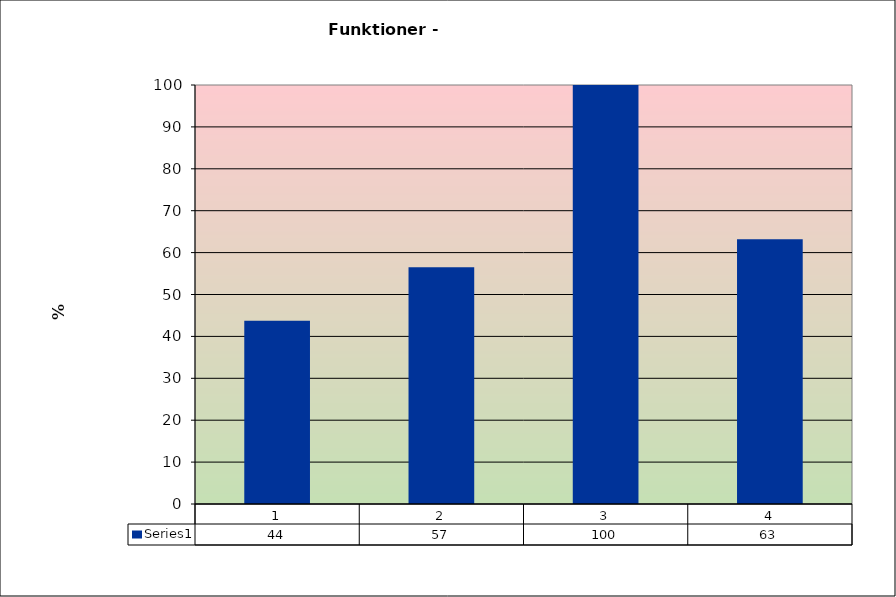
| Category | Series1 |
|---|---|
| 0 | 43.75 |
| 1 | 56.522 |
| 2 | 100 |
| 3 | 63.158 |